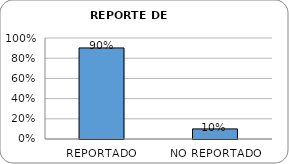
| Category | Series 0 |
|---|---|
| REPORTADO | 0.902 |
| NO REPORTADO | 0.1 |